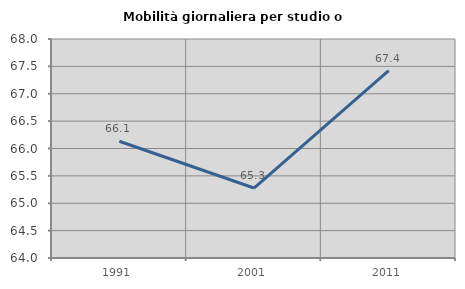
| Category | Mobilità giornaliera per studio o lavoro |
|---|---|
| 1991.0 | 66.133 |
| 2001.0 | 65.278 |
| 2011.0 | 67.423 |